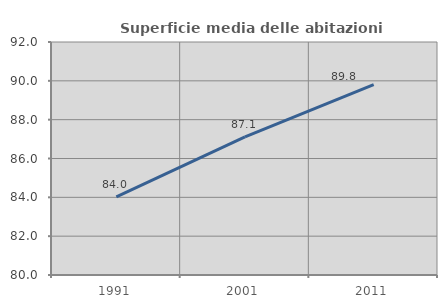
| Category | Superficie media delle abitazioni occupate |
|---|---|
| 1991.0 | 84.025 |
| 2001.0 | 87.111 |
| 2011.0 | 89.805 |